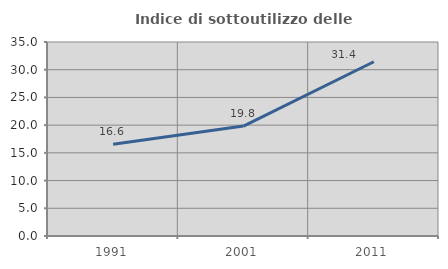
| Category | Indice di sottoutilizzo delle abitazioni  |
|---|---|
| 1991.0 | 16.552 |
| 2001.0 | 19.831 |
| 2011.0 | 31.434 |